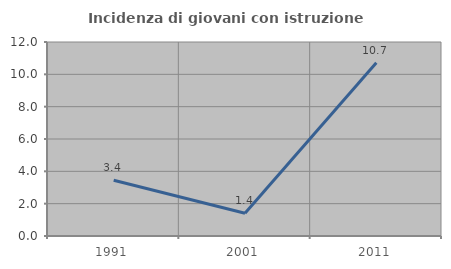
| Category | Incidenza di giovani con istruzione universitaria |
|---|---|
| 1991.0 | 3.448 |
| 2001.0 | 1.408 |
| 2011.0 | 10.714 |